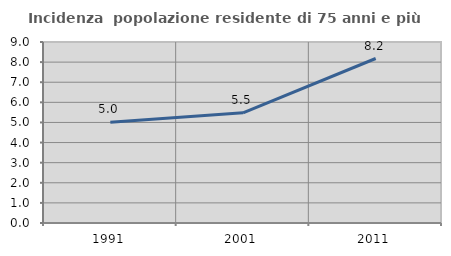
| Category | Incidenza  popolazione residente di 75 anni e più |
|---|---|
| 1991.0 | 5.004 |
| 2001.0 | 5.477 |
| 2011.0 | 8.179 |